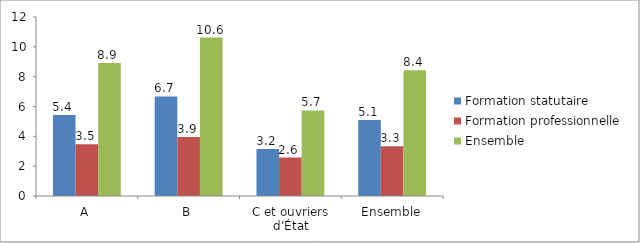
| Category | Formation statutaire | Formation professionnelle | Ensemble |
|---|---|---|---|
| A | 5.435 | 3.475 | 8.91 |
| B | 6.671 | 3.948 | 10.619 |
| C et ouvriers d'État | 3.152 | 2.58 | 5.733 |
| Ensemble | 5.094 | 3.337 | 8.431 |